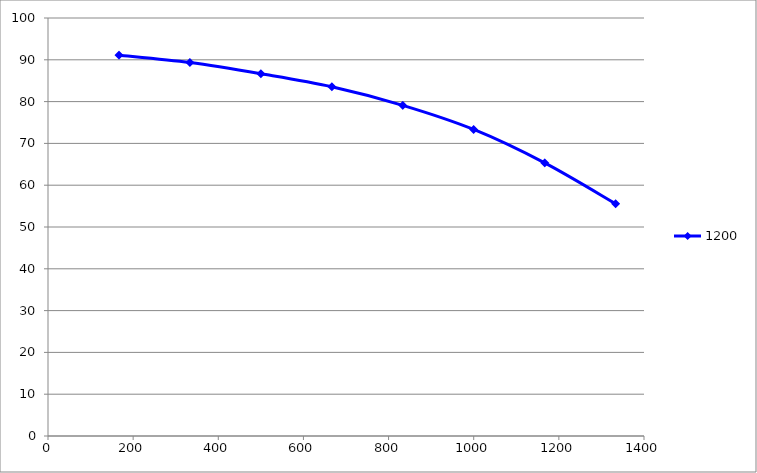
| Category | 1200 |
|---|---|
| 166.66666666666666 | 91.111 |
| 333.3333333333333 | 89.333 |
| 500.0 | 86.667 |
| 666.6666666666666 | 83.556 |
| 833.3333333333333 | 79.111 |
| 1000.0 | 73.333 |
| 1166.6666666666665 | 65.333 |
| 1333.3333333333333 | 55.556 |